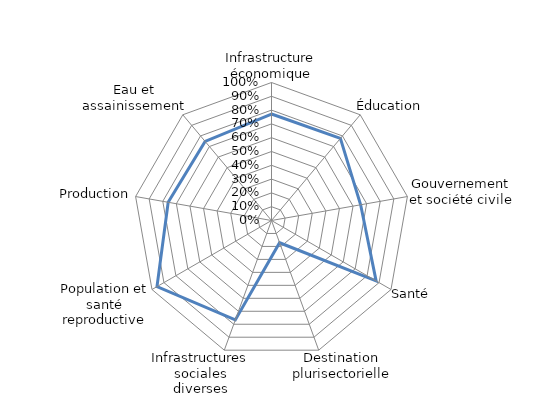
| Category | Series 0 |
|---|---|
| Infrastructure économique | 0.772 |
| Éducation | 0.777 |
| Gouvernement et société civile | 0.656 |
| Santé | 0.875 |
| Destination plurisectorielle | 0.171 |
| Infrastructures sociales diverses | 0.767 |
| Population et santé reproductive | 0.958 |
| Production | 0.76 |
| Eau et assainissement | 0.748 |